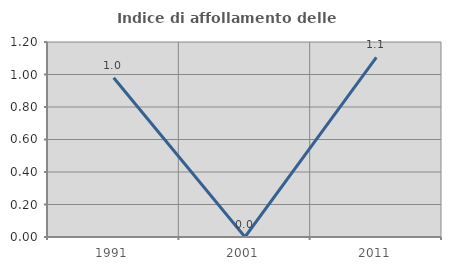
| Category | Indice di affollamento delle abitazioni  |
|---|---|
| 1991.0 | 0.98 |
| 2001.0 | 0 |
| 2011.0 | 1.105 |